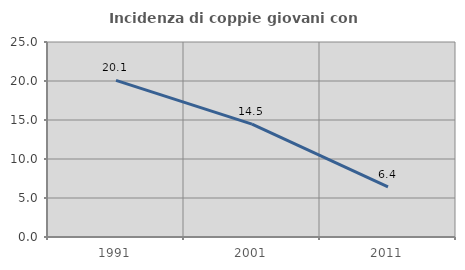
| Category | Incidenza di coppie giovani con figli |
|---|---|
| 1991.0 | 20.077 |
| 2001.0 | 14.48 |
| 2011.0 | 6.426 |